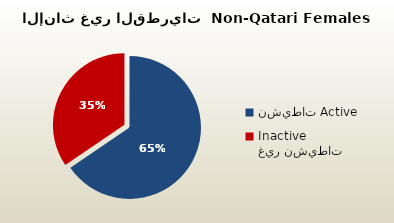
| Category | الاناث غير القطريات  Non-Qatari Females |
|---|---|
| نشيطات Active | 290220 |
| غير نشيطات Inactive | 152870 |